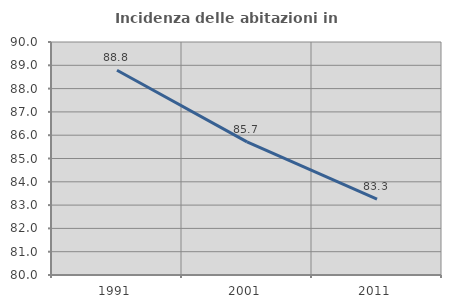
| Category | Incidenza delle abitazioni in proprietà  |
|---|---|
| 1991.0 | 88.789 |
| 2001.0 | 85.714 |
| 2011.0 | 83.251 |